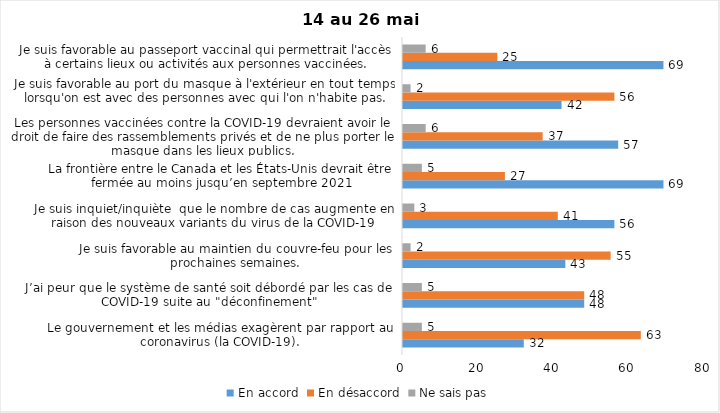
| Category | En accord | En désaccord | Ne sais pas |
|---|---|---|---|
| Le gouvernement et les médias exagèrent par rapport au coronavirus (la COVID-19). | 32 | 63 | 5 |
| J’ai peur que le système de santé soit débordé par les cas de COVID-19 suite au "déconfinement" | 48 | 48 | 5 |
| Je suis favorable au maintien du couvre-feu pour les prochaines semaines. | 43 | 55 | 2 |
| Je suis inquiet/inquiète  que le nombre de cas augmente en raison des nouveaux variants du virus de la COVID-19 | 56 | 41 | 3 |
| La frontière entre le Canada et les États-Unis devrait être fermée au moins jusqu’en septembre 2021 | 69 | 27 | 5 |
| Les personnes vaccinées contre la COVID-19 devraient avoir le droit de faire des rassemblements privés et de ne plus porter le masque dans les lieux publics. | 57 | 37 | 6 |
| Je suis favorable au port du masque à l'extérieur en tout temps lorsqu'on est avec des personnes avec qui l'on n'habite pas. | 42 | 56 | 2 |
| Je suis favorable au passeport vaccinal qui permettrait l'accès à certains lieux ou activités aux personnes vaccinées. | 69 | 25 | 6 |